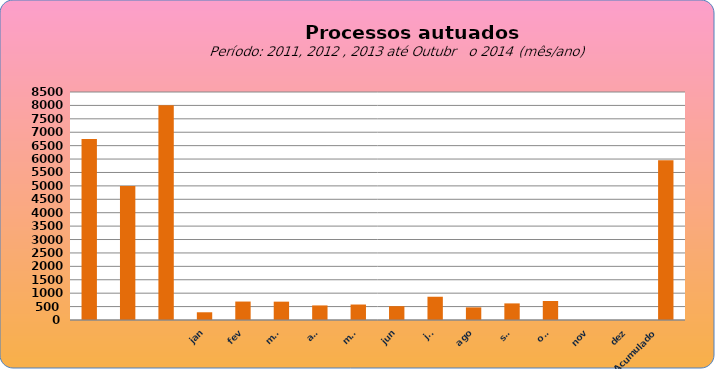
| Category | 6749 4998  8.003   288  688 684 543 577 516 867 471 619 708 0 0 |
|---|---|
|  | 6749 |
|  | 4998 |
|  | 8003 |
| jan | 288 |
| fev | 688 |
| mar | 684 |
| abr | 543 |
| mai | 577 |
| jun | 516 |
| jul | 867 |
| ago | 471 |
| set | 619 |
| out | 708 |
| nov | 0 |
| dez | 0 |
| Acumulado
 | 5951 |